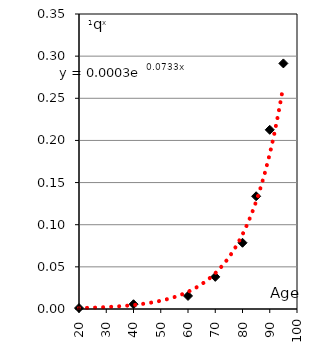
| Category | Series 0 |
|---|---|
| 20.0 | 0.001 |
| 40.0 | 0.006 |
| 60.0 | 0.015 |
| 70.0 | 0.038 |
| 80.0 | 0.079 |
| 85.0 | 0.134 |
| 90.0 | 0.213 |
| 95.0 | 0.291 |